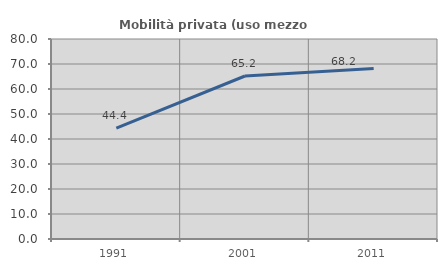
| Category | Mobilità privata (uso mezzo privato) |
|---|---|
| 1991.0 | 44.373 |
| 2001.0 | 65.205 |
| 2011.0 | 68.182 |